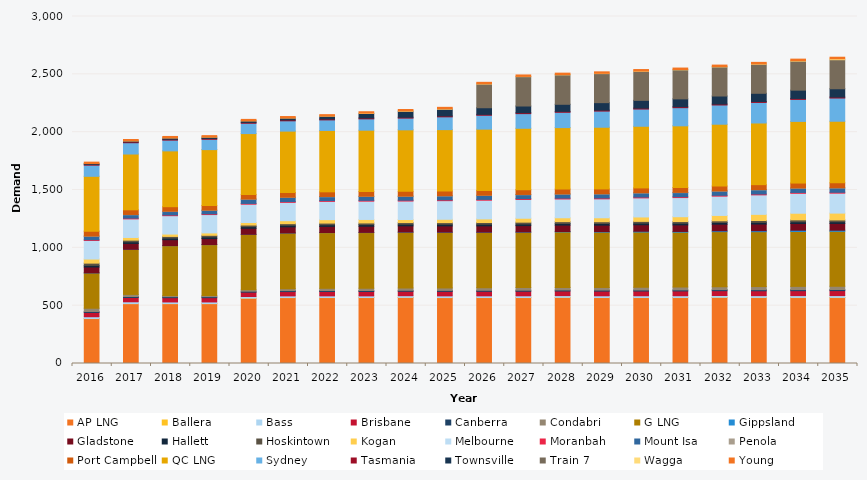
| Category | AP LNG | Ballera | Bass | Brisbane | Canberra | Condabri | G LNG | Gippsland | Gladstone | Hallett | Hoskintown | Kogan | Melbourne | Moranbah | Mount Isa | Penola | Port Campbell | QC LNG | Sydney | Tasmania | Townsville | Train 7 | Wagga | Young |
|---|---|---|---|---|---|---|---|---|---|---|---|---|---|---|---|---|---|---|---|---|---|---|---|---|
| 2016.0 | 388.69 | 0.045 | 15.578 | 36.933 | 8.598 | 28.035 | 305.178 | 0.634 | 50.675 | 13.995 | 19.499 | 35.181 | 160.387 | 6.45 | 29.764 | 2.673 | 42.031 | 474.034 | 96.404 | 7.082 | 6.702 | 0 | 0.295 | 12.098 |
| 2017.0 | 517.774 | 0.099 | 15.681 | 36.877 | 8.674 | 18.121 | 389.235 | 0.682 | 50.776 | 14.162 | 14.294 | 23.243 | 160.756 | 6.443 | 29.052 | 2.701 | 40.117 | 482.502 | 97.571 | 7.202 | 8.388 | 0 | 0.303 | 12.197 |
| 2018.0 | 517.774 | 0.201 | 14.18 | 36.972 | 8.682 | 9.489 | 431.486 | 0.735 | 50.9 | 14.329 | 14.015 | 20.175 | 159.01 | 6.444 | 29.368 | 2.748 | 39.168 | 482.502 | 93.057 | 7.205 | 11.841 | 0 | 0.394 | 12.236 |
| 2019.0 | 517.774 | 0.207 | 14.241 | 37.081 | 8.65 | 9.599 | 440.174 | 0.717 | 51.836 | 14.205 | 13.908 | 20.395 | 158.801 | 6.455 | 29.61 | 2.597 | 40.401 | 482.502 | 89.18 | 7.293 | 11.909 | 0 | 0.328 | 12.226 |
| 2020.0 | 564.85 | 0.294 | 14.299 | 37.184 | 8.576 | 11.919 | 479.07 | 0.734 | 52.105 | 14.17 | 13.876 | 21.56 | 158.664 | 6.642 | 35.522 | 2.571 | 39.677 | 526.174 | 89.06 | 7.375 | 13.513 | 0 | 0.385 | 12.185 |
| 2021.0 | 569.66 | 0.599 | 14.325 | 37.27 | 8.48 | 16.32 | 481.446 | 0.8 | 52.372 | 14.18 | 13.608 | 25.646 | 158.406 | 6.823 | 35.424 | 2.588 | 40.55 | 530.596 | 89.134 | 7.453 | 16.818 | 0 | 0.514 | 12.121 |
| 2022.0 | 569.69 | 0.807 | 14.34 | 37.486 | 8.449 | 19.363 | 481.446 | 0.914 | 52.713 | 14.21 | 14.487 | 29.949 | 157.685 | 7.011 | 32.911 | 2.604 | 40.119 | 530.552 | 91.46 | 7.526 | 24.478 | 0 | 1.2 | 12.121 |
| 2023.0 | 569.719 | 0.645 | 14.376 | 37.799 | 8.493 | 19.937 | 481.095 | 1.41 | 53.109 | 14.392 | 14.105 | 30.148 | 158.37 | 7.046 | 33.176 | 2.683 | 40.014 | 530.508 | 98.107 | 7.595 | 38.825 | 0 | 2.941 | 12.183 |
| 2024.0 | 571.273 | 0.45 | 14.485 | 38.191 | 8.587 | 19.563 | 482.383 | 1.634 | 53.523 | 14.448 | 14.006 | 26.523 | 159.628 | 7.084 | 32.959 | 2.686 | 40.742 | 531.883 | 101.496 | 7.66 | 51.2 | 0 | 3.118 | 12.289 |
| 2025.0 | 569.778 | 0.506 | 14.589 | 38.594 | 8.685 | 20.959 | 480.387 | 2.216 | 53.926 | 14.428 | 14.067 | 28.651 | 161.109 | 7.122 | 33.262 | 2.62 | 40.472 | 530.596 | 110.487 | 7.721 | 56.461 | 2.618 | 3 | 12.4 |
| 2026.0 | 569.808 | 0.585 | 14.685 | 38.985 | 8.783 | 22.082 | 478.287 | 2.394 | 54.332 | 14.436 | 14.617 | 31.025 | 161.613 | 7.159 | 33.546 | 2.66 | 40.693 | 530.552 | 119.913 | 7.779 | 57.248 | 204.958 | 2.25 | 12.511 |
| 2027.0 | 569.837 | 0.703 | 14.781 | 39.392 | 8.878 | 22.715 | 478.287 | 2.625 | 54.772 | 14.456 | 15.557 | 33.803 | 162.16 | 7.199 | 33.856 | 2.654 | 41.38 | 530.508 | 126.692 | 7.833 | 58.081 | 253.813 | 2.058 | 12.618 |
| 2028.0 | 571.392 | 0.681 | 14.875 | 39.803 | 8.968 | 22.258 | 479.567 | 3.678 | 55.181 | 14.383 | 15.563 | 33.626 | 162.436 | 7.24 | 34.163 | 2.568 | 41.194 | 531.883 | 132.354 | 7.883 | 61.34 | 254.492 | 1.991 | 12.72 |
| 2029.0 | 569.896 | 0.715 | 14.964 | 40.226 | 9.058 | 22.448 | 478.287 | 4.65 | 55.639 | 14.408 | 15.306 | 34.311 | 163.634 | 7.282 | 34.465 | 2.561 | 41.494 | 533.213 | 139.765 | 7.929 | 65.042 | 251.019 | 2.389 | 12.822 |
| 2030.0 | 569.926 | 0.845 | 15.061 | 40.665 | 9.155 | 23.556 | 477.317 | 6.69 | 56.128 | 14.459 | 14.861 | 38.239 | 164.922 | 7.327 | 34.782 | 2.542 | 41.402 | 533.169 | 148.87 | 7.973 | 67.044 | 251.019 | 2.597 | 12.931 |
| 2031.0 | 569.956 | 0.964 | 15.17 | 41.11 | 9.258 | 24.339 | 474.439 | 6.405 | 56.588 | 14.448 | 14.67 | 41.66 | 165.52 | 7.373 | 35.102 | 2.527 | 42.04 | 533.125 | 157.062 | 8.02 | 68.029 | 251.019 | 2.444 | 13.044 |
| 2032.0 | 571.511 | 1.098 | 15.288 | 41.569 | 9.37 | 25.527 | 475.709 | 7.114 | 57.088 | 14.505 | 14.857 | 46.404 | 166.837 | 7.422 | 35.437 | 2.545 | 41.912 | 534.498 | 166.308 | 8.066 | 69.499 | 251.7 | 2.509 | 13.165 |
| 2033.0 | 570.015 | 1.269 | 15.405 | 42.043 | 9.486 | 26.939 | 474.439 | 8.365 | 57.616 | 14.522 | 16.432 | 52.832 | 168.578 | 7.472 | 35.784 | 2.548 | 42.596 | 533.037 | 177.695 | 8.111 | 70.922 | 251.019 | 3.026 | 13.292 |
| 2034.0 | 570.044 | 1.382 | 15.522 | 42.517 | 9.601 | 27.852 | 474.439 | 11.051 | 58.124 | 14.626 | 16.673 | 57.195 | 172.33 | 7.539 | 36.132 | 2.588 | 42.383 | 532.994 | 190.333 | 8.155 | 71.664 | 251.019 | 3.853 | 13.418 |
| 2035.0 | 570.074 | 1.436 | 15.639 | 42.99 | 9.711 | 28.287 | 474.439 | 9.77 | 58.621 | 14.679 | 15.345 | 59.165 | 172.599 | 7.606 | 36.483 | 2.604 | 42.463 | 532.543 | 200.742 | 8.197 | 71.929 | 251.019 | 8.035 | 13.536 |